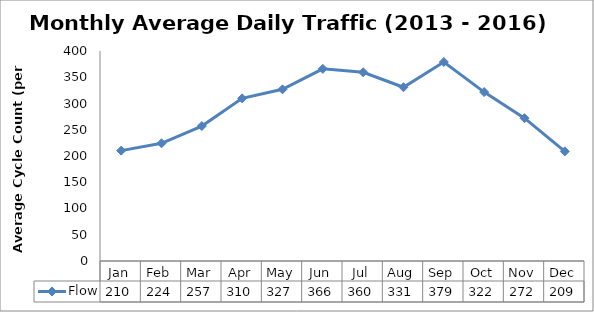
| Category | Flow |
|---|---|
| Jan | 210.25 |
| Feb | 224.25 |
| Mar | 257 |
| Apr | 309.75 |
| May | 327 |
| Jun | 366 |
| Jul | 359.5 |
| Aug | 331 |
| Sep | 379 |
| Oct | 321.75 |
| Nov | 272 |
| Dec | 208.75 |